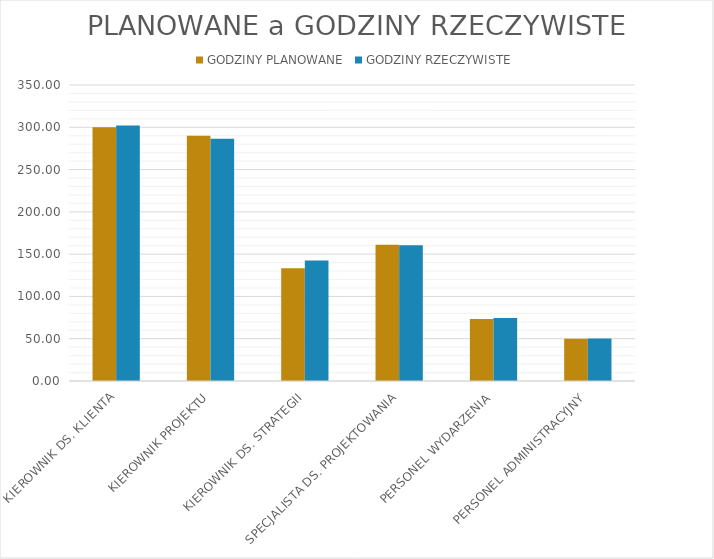
| Category | GODZINY PLANOWANE | GODZINY RZECZYWISTE |
|---|---|---|
| KIEROWNIK DS. KLIENTA | 300 | 302 |
| KIEROWNIK PROJEKTU | 290 | 286.333 |
| KIEROWNIK DS. STRATEGII | 133.333 | 142.5 |
| SPECJALISTA DS. PROJEKTOWANIA | 161.111 | 160.556 |
| PERSONEL WYDARZENIA | 73.333 | 74.444 |
| PERSONEL ADMINISTRACYJNY | 50 | 50.333 |